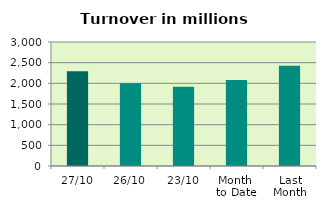
| Category | Series 0 |
|---|---|
| 27/10 | 2295.053 |
| 26/10 | 2000.334 |
| 23/10 | 1914.841 |
| Month 
to Date | 2079.236 |
| Last
Month | 2424.403 |